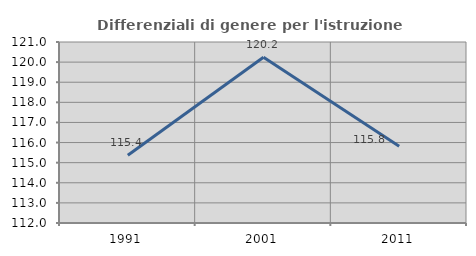
| Category | Differenziali di genere per l'istruzione superiore |
|---|---|
| 1991.0 | 115.372 |
| 2001.0 | 120.238 |
| 2011.0 | 115.819 |